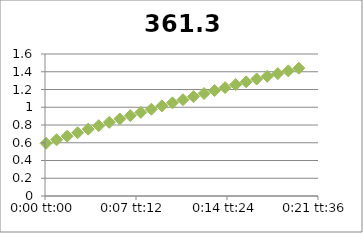
| Category | 361.3 |
|---|---|
| 5.78703703703704e-05 | 0.594 |
| 0.000636574074074074 | 0.634 |
| 0.00121527777777778 | 0.674 |
| 0.00179398148148148 | 0.713 |
| 0.00237268518518518 | 0.753 |
| 0.00295138888888889 | 0.792 |
| 0.00353009259259259 | 0.83 |
| 0.0041087962962963 | 0.868 |
| 0.0046875 | 0.905 |
| 0.0052662037037037 | 0.942 |
| 0.00584490740740741 | 0.978 |
| 0.00642361111111111 | 1.015 |
| 0.00700231481481481 | 1.05 |
| 0.00758101851851852 | 1.085 |
| 0.00815972222222222 | 1.12 |
| 0.00873842592592592 | 1.155 |
| 0.00931712962962963 | 1.188 |
| 0.00989583333333333 | 1.221 |
| 0.010474537037037 | 1.255 |
| 0.0110532407407407 | 1.286 |
| 0.0116319444444444 | 1.318 |
| 0.0122106481481481 | 1.349 |
| 0.0127893518518518 | 1.379 |
| 0.0133680555555556 | 1.41 |
| 0.0139467592592593 | 1.44 |